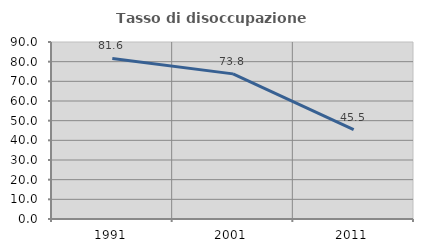
| Category | Tasso di disoccupazione giovanile  |
|---|---|
| 1991.0 | 81.622 |
| 2001.0 | 73.786 |
| 2011.0 | 45.455 |